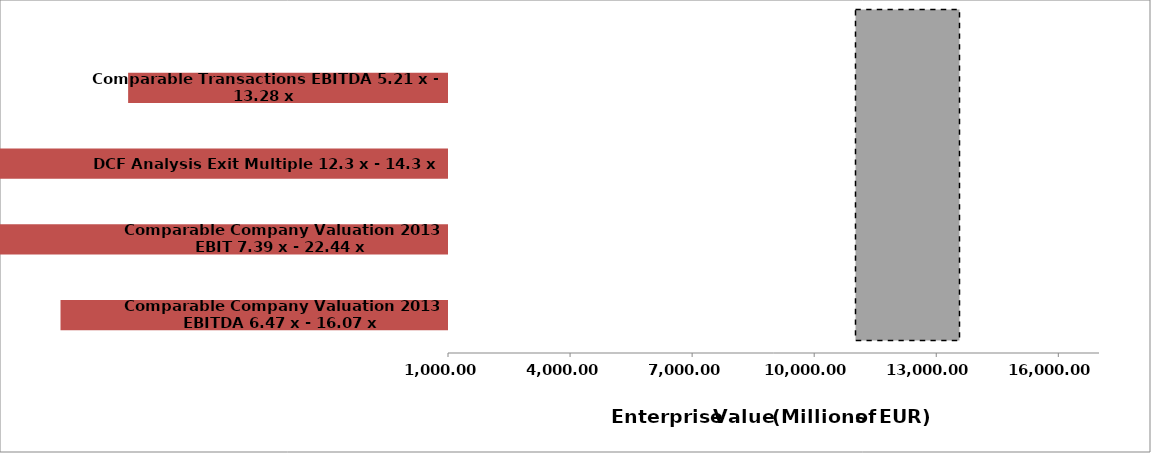
| Category | Series 0 | Series 1 |
|---|---|---|
| Comparable Company Valuation 2013 EBITDA 6.47 x - 16.07 x | -8523.383 | -12641.357 |
| Comparable Company Valuation 2013 EBIT 7.39 x - 22.44 x | -14825.16 | -30182.352 |
| DCF Analysis Exit Multiple 12.3 x - 14.3 x | -15297.407 | -1675.146 |
| Comparable Transactions EBITDA 5.21 x - 13.28 x | -6861.57 | -10622.922 |